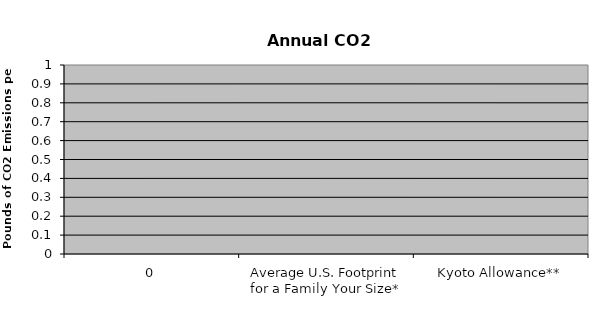
| Category | Series 0 |
|---|---|
| 0 | 0 |
| Average U.S. Footprint for a Family Your Size* | 0 |
| Kyoto Allowance** | 0 |